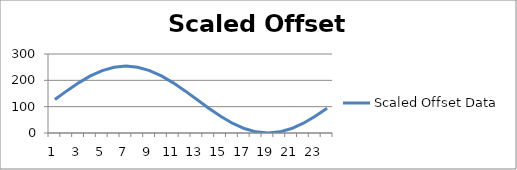
| Category | Scaled Offset Data |
|---|---|
| 0 | 127 |
| 1 | 159.87 |
| 2 | 190.5 |
| 3 | 216.803 |
| 4 | 236.985 |
| 5 | 249.673 |
| 6 | 254 |
| 7 | 249.673 |
| 8 | 236.985 |
| 9 | 216.803 |
| 10 | 190.5 |
| 11 | 159.87 |
| 12 | 127 |
| 13 | 94.13 |
| 14 | 63.5 |
| 15 | 37.197 |
| 16 | 17.015 |
| 17 | 4.327 |
| 18 | 0 |
| 19 | 4.327 |
| 20 | 17.015 |
| 21 | 37.197 |
| 22 | 63.5 |
| 23 | 94.13 |